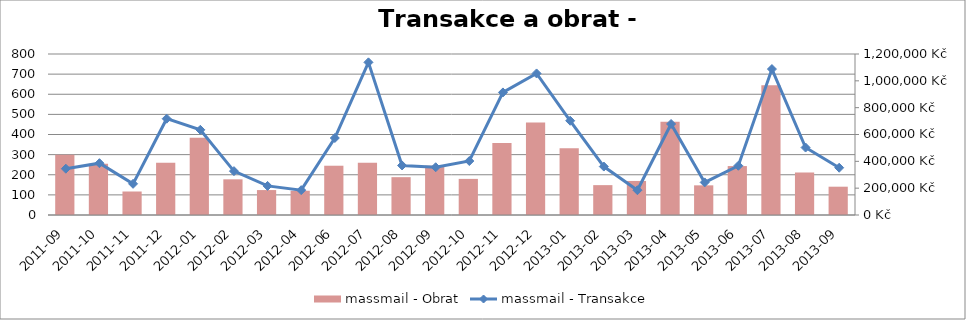
| Category | massmail - Obrat |
|---|---|
| 2011-09 | 449472.624 |
| 2011-10 | 382138.053 |
| 2011-11 | 175194.824 |
| 2011-12 | 390347.085 |
| 2012-01 | 575842.452 |
| 2012-02 | 265897.355 |
| 2012-03 | 185853.998 |
| 2012-04 | 180721.393 |
| 2012-06 | 367290.418 |
| 2012-07 | 388850.523 |
| 2012-08 | 281980.573 |
| 2012-09 | 367864.447 |
| 2012-10 | 269138.743 |
| 2012-11 | 537438.387 |
| 2012-12 | 690214.374 |
| 2013-01 | 497745.896 |
| 2013-02 | 222622.551 |
| 2013-03 | 253688.004 |
| 2013-04 | 695506.491 |
| 2013-05 | 221054.019 |
| 2013-06 | 364691.421 |
| 2013-07 | 966865.892 |
| 2013-08 | 316456.847 |
| 2013-09 | 210963.026 |